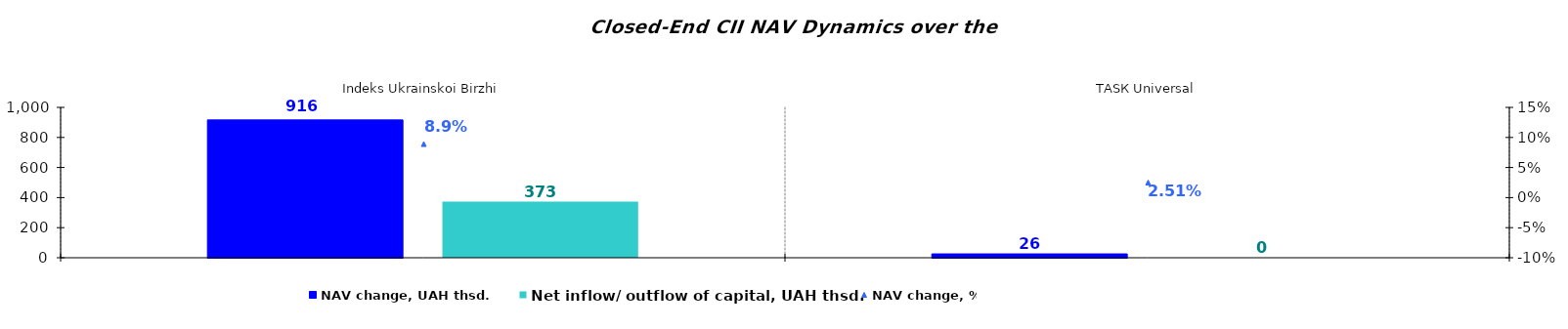
| Category | NAV change, UAH thsd. | Net inflow/ outflow of capital, UAH thsd. |
|---|---|---|
| Іndeks Ukrainskoi Birzhi | 916.453 | 372.837 |
| ТАSК Universal | 25.58 | 0 |